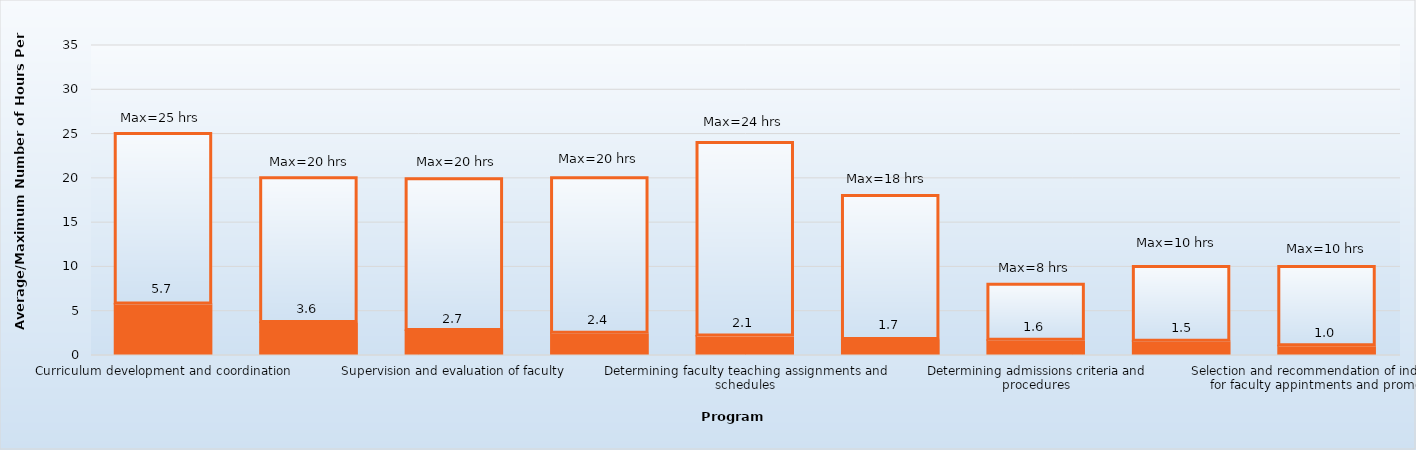
| Category | Average hours per week | Maximum |
|---|---|---|
| Curriculum development and coordination | 5.7 | 19.3 |
| Development and responsibilities to maintain CODA accreditation compliance and documentation | 3.6 | 16.4 |
| Supervision and evaluation of faculty | 2.7 | 17.2 |
| Fiscal administration | 2.4 | 17.6 |
| Determining faculty teaching assignments and schedules | 2.1 | 21.9 |
| Budget preparation | 1.7 | 16.3 |
| Determining admissions criteria and procedures | 1.6 | 6.4 |
| Scheduling use of program facilities | 1.5 | 8.5 |
| Selection and recommendation of individuals for faculty appintments and promotion | 1 | 9 |